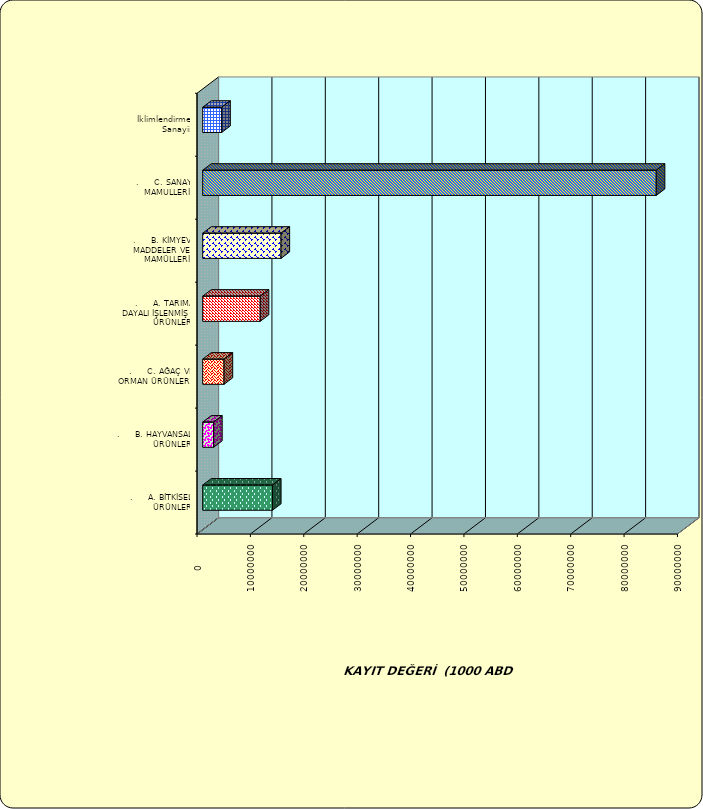
| Category | Series 0 |
|---|---|
| .     A. BİTKİSEL ÜRÜNLER | 13067486.484 |
| .     B. HAYVANSAL ÜRÜNLER | 2038896.675 |
| .     C. AĞAÇ VE ORMAN ÜRÜNLERİ | 4002845.396 |
| .     A. TARIMA DAYALI İŞLENMİŞ ÜRÜNLER | 10774802.843 |
| .     B. KİMYEVİ MADDELER VE MAMÜLLERİ | 14672486.414 |
| .     C. SANAYİ MAMULLERİ | 84957880.021 |
|  İklimlendirme Sanayii | 3563551.014 |